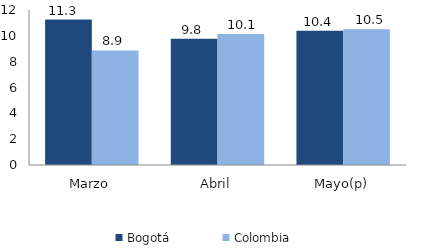
| Category | Bogotá | Colombia |
|---|---|---|
| Marzo | 11.261 | 8.868 |
| Abril | 9.773 | 10.14 |
| Mayo(p) | 10.385 | 10.517 |